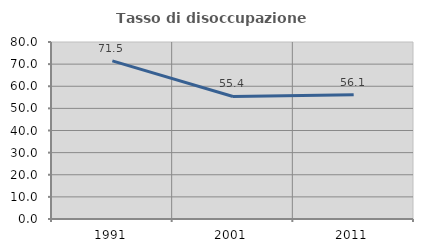
| Category | Tasso di disoccupazione giovanile  |
|---|---|
| 1991.0 | 71.459 |
| 2001.0 | 55.396 |
| 2011.0 | 56.107 |